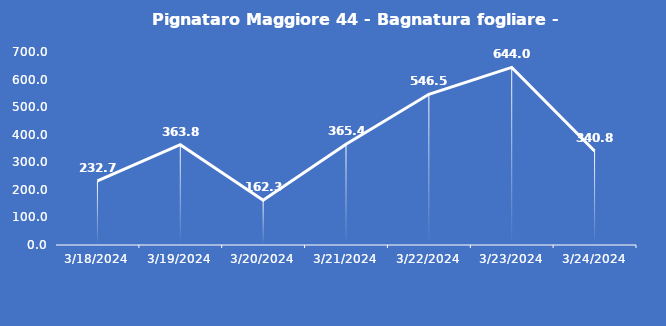
| Category | Pignataro Maggiore 44 - Bagnatura fogliare - Grezzo (min) |
|---|---|
| 3/18/24 | 232.7 |
| 3/19/24 | 363.8 |
| 3/20/24 | 162.3 |
| 3/21/24 | 365.4 |
| 3/22/24 | 546.5 |
| 3/23/24 | 644 |
| 3/24/24 | 340.8 |